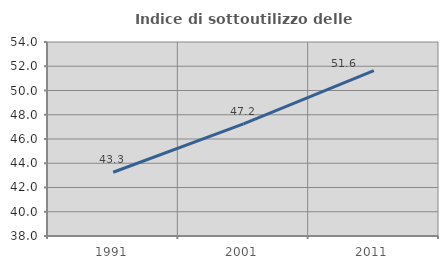
| Category | Indice di sottoutilizzo delle abitazioni  |
|---|---|
| 1991.0 | 43.26 |
| 2001.0 | 47.249 |
| 2011.0 | 51.636 |